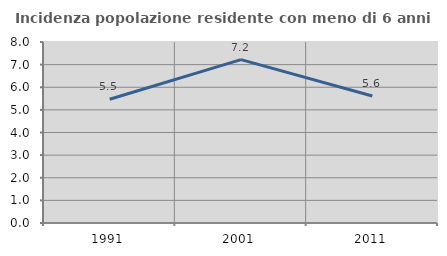
| Category | Incidenza popolazione residente con meno di 6 anni |
|---|---|
| 1991.0 | 5.47 |
| 2001.0 | 7.221 |
| 2011.0 | 5.616 |